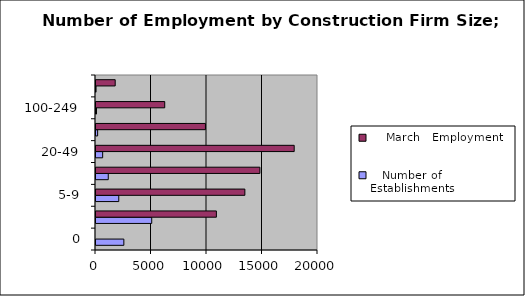
| Category |    Number of |     March |
|---|---|---|
| 0 | 2509 | 0 |
| 1-4 | 5021 | 10846 |
| 5-9 | 2051 | 13412 |
| 10-19 | 1105 | 14764 |
| 20-49 | 600 | 17856 |
| 50-99 | 147 | 9860 |
| 100-249 | 46 | 6192 |
| 250 & Over | 5 | 1730 |